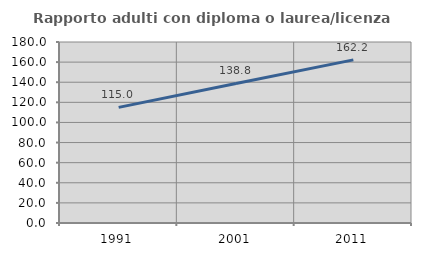
| Category | Rapporto adulti con diploma o laurea/licenza media  |
|---|---|
| 1991.0 | 115.014 |
| 2001.0 | 138.814 |
| 2011.0 | 162.245 |